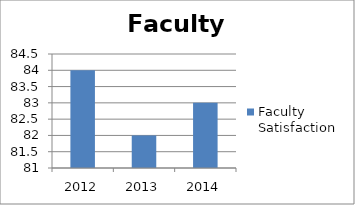
| Category | Faculty Satisfaction |
|---|---|
| 2012.0 | 84 |
| 2013.0 | 82 |
| 2014.0 | 83 |